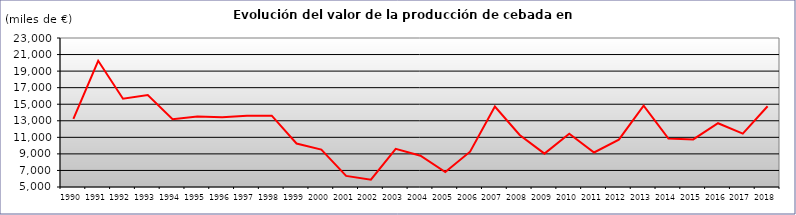
| Category | VALOR 
(miles de €) |
|---|---|
| 1990.0 | 13233.085 |
| 1991.0 | 20251.103 |
| 1992.0 | 15658.168 |
| 1993.0 | 16105.922 |
| 1994.0 | 13186.206 |
| 1995.0 | 13502.939 |
| 1996.0 | 13423.305 |
| 1997.0 | 13616.53 |
| 1998.0 | 13617.131 |
| 1999.0 | 10254.469 |
| 2000.0 | 9515.5 |
| 2001.0 | 6339.3 |
| 2002.0 | 5883 |
| 2003.0 | 9608.4 |
| 2004.0 | 8777.6 |
| 2005.0 | 6799.7 |
| 2006.0 | 9267.1 |
| 2007.0 | 14720.5 |
| 2008.0 | 11283.3 |
| 2009.0 | 9031.6 |
| 2010.0 | 11443.3 |
| 2011.0 | 9169.5 |
| 2012.0 | 10713.3 |
| 2013.0 | 14831.32 |
| 2014.0 | 10855.34 |
| 2015.0 | 10744.9 |
| 2016.0 | 12703.01 |
| 2017.0 | 11444.45 |
| 2018.0 | 14758.26 |